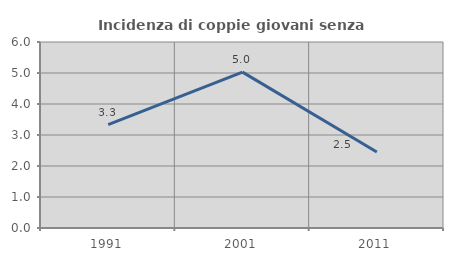
| Category | Incidenza di coppie giovani senza figli |
|---|---|
| 1991.0 | 3.333 |
| 2001.0 | 5.028 |
| 2011.0 | 2.454 |